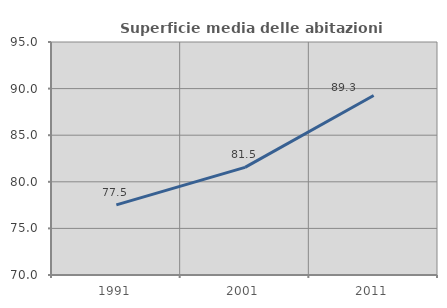
| Category | Superficie media delle abitazioni occupate |
|---|---|
| 1991.0 | 77.528 |
| 2001.0 | 81.544 |
| 2011.0 | 89.259 |